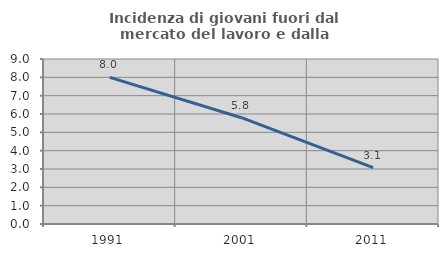
| Category | Incidenza di giovani fuori dal mercato del lavoro e dalla formazione  |
|---|---|
| 1991.0 | 8 |
| 2001.0 | 5.797 |
| 2011.0 | 3.077 |